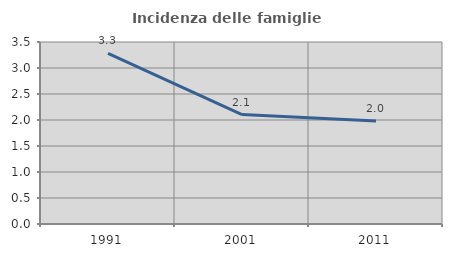
| Category | Incidenza delle famiglie numerose |
|---|---|
| 1991.0 | 3.281 |
| 2001.0 | 2.104 |
| 2011.0 | 1.98 |